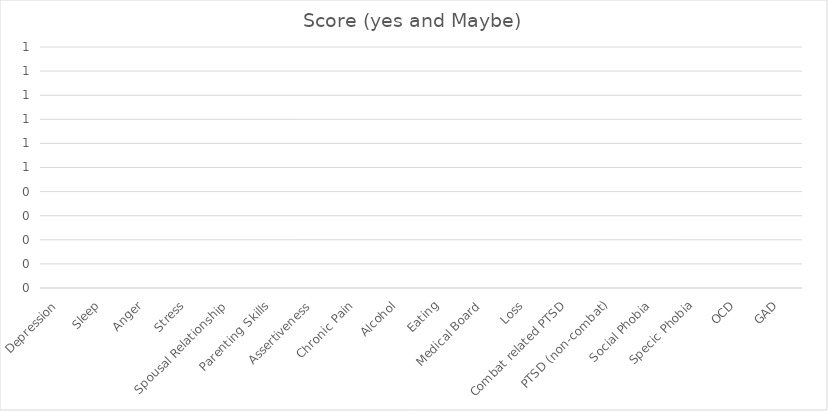
| Category | Score (yes and Maybe) |
|---|---|
| Depression | 0 |
| Sleep | 0 |
| Anger | 0 |
| Stress | 0 |
| Spousal Relationship | 0 |
| Parenting Skills | 0 |
| Assertiveness | 0 |
| Chronic Pain | 0 |
| Alcohol | 0 |
| Eating | 0 |
| Medical Board | 0 |
| Loss | 0 |
| Combat related PTSD | 0 |
| PTSD (non-combat) | 0 |
| Social Phobia | 0 |
| Specic Phobia | 0 |
| OCD | 0 |
| GAD | 0 |